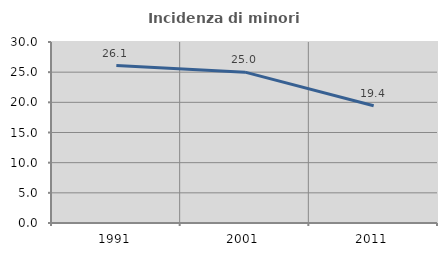
| Category | Incidenza di minori stranieri |
|---|---|
| 1991.0 | 26.087 |
| 2001.0 | 25 |
| 2011.0 | 19.435 |